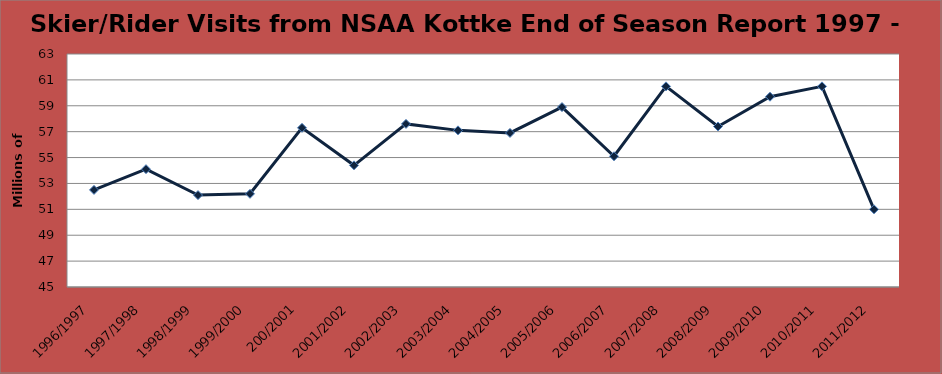
| Category | Skier/Rider Vists |
|---|---|
| 1996/1997 | 52.5 |
| 1997/1998 | 54.1 |
| 1998/1999 | 52.1 |
| 1999/2000 | 52.2 |
| 200/2001 | 57.3 |
| 2001/2002 | 54.4 |
| 2002/2003 | 57.6 |
| 2003/2004 | 57.1 |
| 2004/2005 | 56.9 |
| 2005/2006 | 58.9 |
| 2006/2007 | 55.1 |
| 2007/2008 | 60.5 |
| 2008/2009 | 57.4 |
| 2009/2010 | 59.7 |
| 2010/2011 | 60.5 |
| 2011/2012 | 51 |